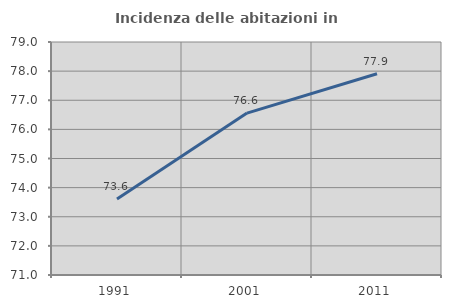
| Category | Incidenza delle abitazioni in proprietà  |
|---|---|
| 1991.0 | 73.614 |
| 2001.0 | 76.56 |
| 2011.0 | 77.909 |